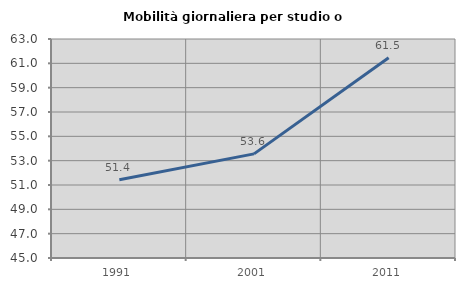
| Category | Mobilità giornaliera per studio o lavoro |
|---|---|
| 1991.0 | 51.429 |
| 2001.0 | 53.558 |
| 2011.0 | 61.466 |